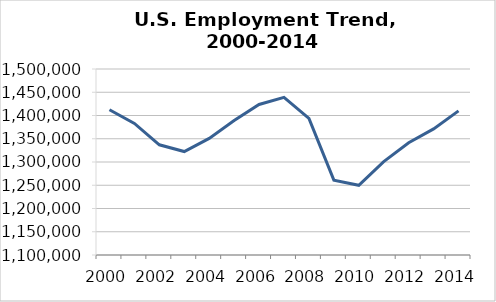
| Category | Series 0 |
|---|---|
| 2000.0 | 1412426 |
| 2001.0 | 1382991 |
| 2002.0 | 1337057 |
| 2003.0 | 1322438 |
| 2004.0 | 1350775 |
| 2005.0 | 1389007 |
| 2006.0 | 1423705 |
| 2007.0 | 1439161 |
| 2008.0 | 1393766 |
| 2009.0 | 1260908 |
| 2010.0 | 1249934 |
| 2011.0 | 1300767 |
| 2012.0 | 1341366 |
| 2013.0 | 1371104 |
| 2014.0 | 1409980 |